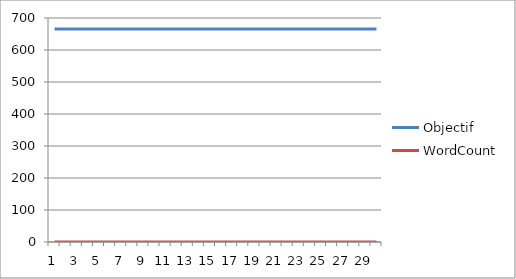
| Category | Objectif | WordCount |
|---|---|---|
| 0 | 666 | 0 |
| 1 | 666 | 0 |
| 2 | 666 | 0 |
| 3 | 666 | 0 |
| 4 | 666 | 0 |
| 5 | 666 | 0 |
| 6 | 666 | 0 |
| 7 | 666 | 0 |
| 8 | 666 | 0 |
| 9 | 666 | 0 |
| 10 | 666 | 0 |
| 11 | 666 | 0 |
| 12 | 666 | 0 |
| 13 | 666 | 0 |
| 14 | 666 | 0 |
| 15 | 666 | 0 |
| 16 | 666 | 0 |
| 17 | 666 | 0 |
| 18 | 666 | 0 |
| 19 | 666 | 0 |
| 20 | 666 | 0 |
| 21 | 666 | 0 |
| 22 | 666 | 0 |
| 23 | 666 | 0 |
| 24 | 666 | 0 |
| 25 | 666 | 0 |
| 26 | 666 | 0 |
| 27 | 666 | 0 |
| 28 | 666 | 0 |
| 29 | 666 | 0 |